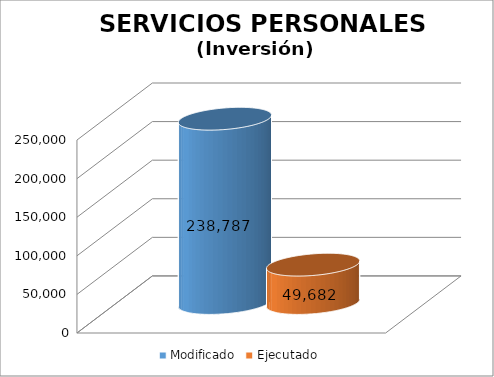
| Category | Modificado | Ejecutado |
|---|---|---|
| 0 | 238787 | 49682.35 |